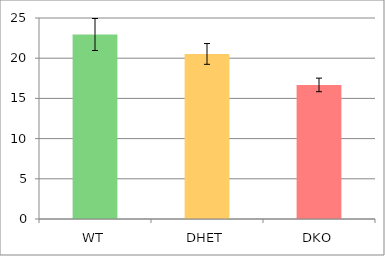
| Category | Series 0 |
|---|---|
| WT | 22.947 |
| DHET | 20.531 |
| DKO | 16.677 |